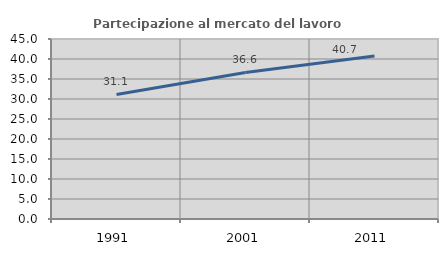
| Category | Partecipazione al mercato del lavoro  femminile |
|---|---|
| 1991.0 | 31.142 |
| 2001.0 | 36.644 |
| 2011.0 | 40.741 |